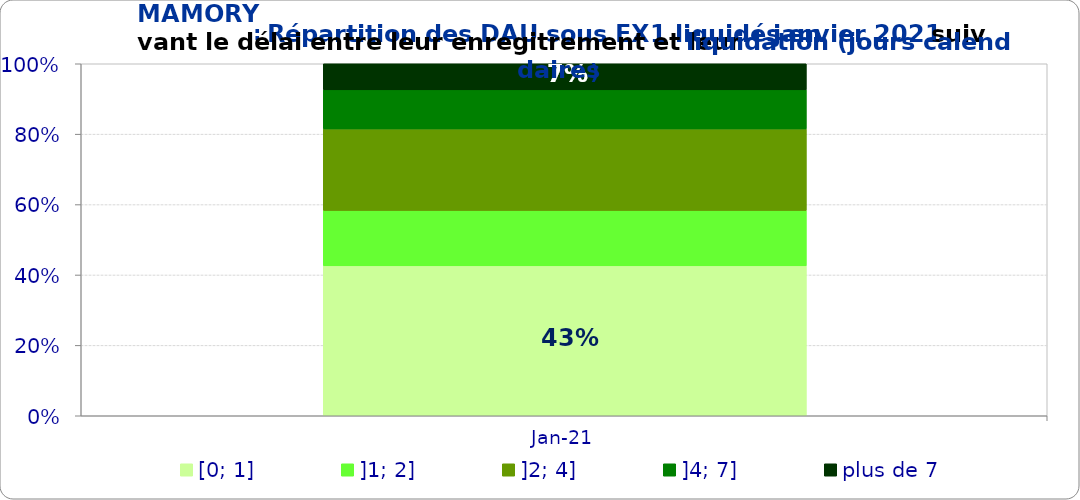
| Category | [0; 1] | ]1; 2] | ]2; 4] | ]4; 7] | plus de 7 |
|---|---|---|---|---|---|
| 2021-01-01 | 0.426 | 0.157 | 0.231 | 0.111 | 0.074 |